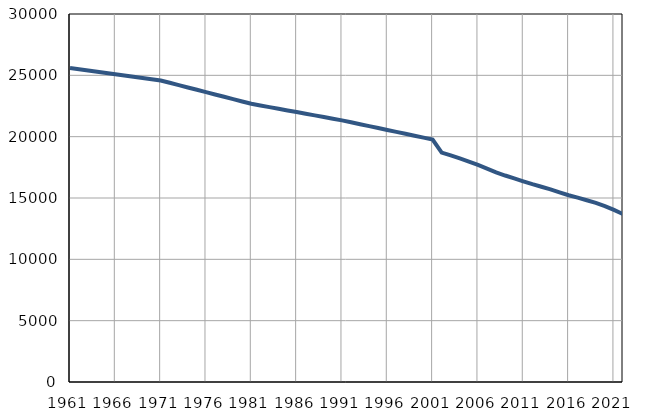
| Category | Број
становника |
|---|---|
| 1961.0 | 25606 |
| 1962.0 | 25504 |
| 1963.0 | 25401 |
| 1964.0 | 25299 |
| 1965.0 | 25196 |
| 1966.0 | 25094 |
| 1967.0 | 24991 |
| 1968.0 | 24889 |
| 1969.0 | 24786 |
| 1970.0 | 24684 |
| 1971.0 | 24581 |
| 1972.0 | 24391 |
| 1973.0 | 24201 |
| 1974.0 | 24010 |
| 1975.0 | 23820 |
| 1976.0 | 23630 |
| 1977.0 | 23440 |
| 1978.0 | 23250 |
| 1979.0 | 23059 |
| 1980.0 | 22869 |
| 1981.0 | 22679 |
| 1982.0 | 22544 |
| 1983.0 | 22409 |
| 1984.0 | 22275 |
| 1985.0 | 22140 |
| 1986.0 | 22005 |
| 1987.0 | 21870 |
| 1988.0 | 21735 |
| 1989.0 | 21601 |
| 1990.0 | 21466 |
| 1991.0 | 21331 |
| 1992.0 | 21175 |
| 1993.0 | 21018 |
| 1994.0 | 20862 |
| 1995.0 | 20705 |
| 1996.0 | 20549 |
| 1997.0 | 20392 |
| 1998.0 | 20236 |
| 1999.0 | 20079 |
| 2000.0 | 19923 |
| 2001.0 | 19766 |
| 2002.0 | 18699 |
| 2003.0 | 18474 |
| 2004.0 | 18224 |
| 2005.0 | 17961 |
| 2006.0 | 17692 |
| 2007.0 | 17394 |
| 2008.0 | 17087 |
| 2009.0 | 16832 |
| 2010.0 | 16602 |
| 2011.0 | 16362 |
| 2012.0 | 16128 |
| 2013.0 | 15916 |
| 2014.0 | 15706 |
| 2015.0 | 15458 |
| 2016.0 | 15226 |
| 2017.0 | 15025 |
| 2018.0 | 14814 |
| 2019.0 | 14601 |
| 2020.0 | 14343 |
| 2021.0 | 14029 |
| 2022.0 | 13692 |